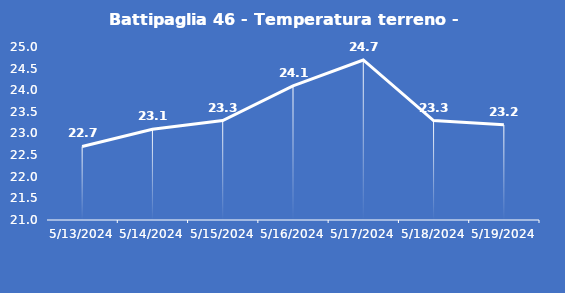
| Category | Battipaglia 46 - Temperatura terreno - Max (°C) |
|---|---|
| 5/13/24 | 22.7 |
| 5/14/24 | 23.1 |
| 5/15/24 | 23.3 |
| 5/16/24 | 24.1 |
| 5/17/24 | 24.7 |
| 5/18/24 | 23.3 |
| 5/19/24 | 23.2 |